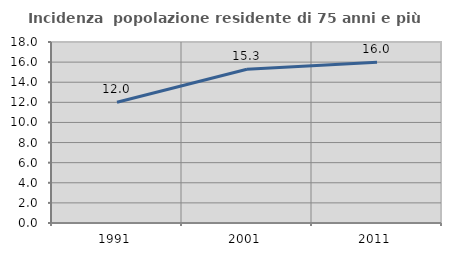
| Category | Incidenza  popolazione residente di 75 anni e più |
|---|---|
| 1991.0 | 12.005 |
| 2001.0 | 15.289 |
| 2011.0 | 15.979 |